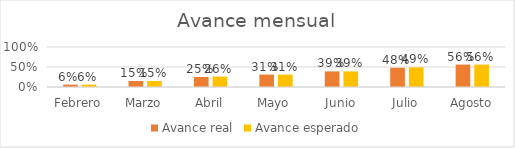
| Category | Avance real | Avance esperado |
|---|---|---|
| Febrero | 0.06 | 0.06 |
| Marzo | 0.15 | 0.15 |
| Abril | 0.25 | 0.26 |
| Mayo | 0.31 | 0.31 |
| Junio | 0.39 | 0.39 |
| Julio | 0.48 | 0.49 |
| Agosto | 0.56 | 0.56 |